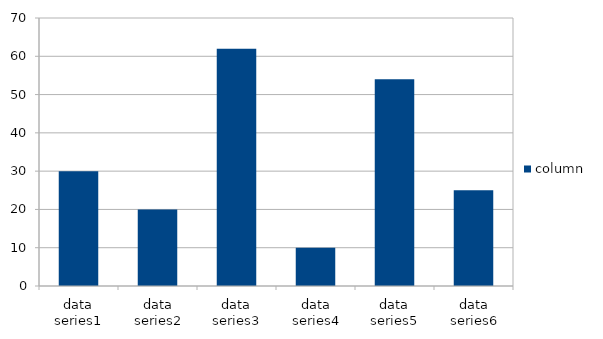
| Category | column |
|---|---|
| data series1 | 30 |
| data series2 | 20 |
| data series3 | 62 |
| data series4 | 10 |
| data series5 | 54 |
| data series6 | 25 |